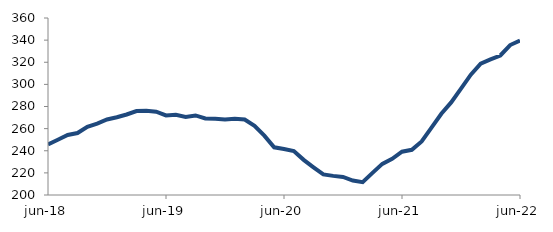
| Category | Series 0 |
|---|---|
| 2018-06-01 | 245.721 |
| 2018-07-01 | 249.922 |
| 2018-08-01 | 254.259 |
| 2018-09-01 | 256.028 |
| 2018-10-01 | 261.709 |
| 2018-11-01 | 264.559 |
| 2018-12-01 | 268.288 |
| 2019-01-01 | 270.264 |
| 2019-02-01 | 272.765 |
| 2019-03-01 | 275.922 |
| 2019-04-01 | 276.17 |
| 2019-05-01 | 275.323 |
| 2019-06-01 | 271.933 |
| 2019-07-01 | 272.528 |
| 2019-08-01 | 270.617 |
| 2019-09-01 | 271.909 |
| 2019-10-01 | 269.246 |
| 2019-11-01 | 268.873 |
| 2019-12-01 | 268.319 |
| 2020-01-01 | 268.914 |
| 2020-02-01 | 268.233 |
| 2020-03-01 | 262.58 |
| 2020-04-01 | 253.663 |
| 2020-05-01 | 243.088 |
| 2020-06-01 | 241.541 |
| 2020-07-01 | 239.786 |
| 2020-08-01 | 231.766 |
| 2020-09-01 | 225.047 |
| 2020-10-01 | 218.571 |
| 2020-11-01 | 217.286 |
| 2020-12-01 | 216.368 |
| 2021-01-01 | 213.087 |
| 2021-02-01 | 211.643 |
| 2021-03-01 | 220.04 |
| 2021-04-01 | 228.12 |
| 2021-05-01 | 232.717 |
| 2021-06-01 | 239.097 |
| 2021-07-01 | 240.846 |
| 2021-08-01 | 248.449 |
| 2021-09-01 | 260.934 |
| 2021-10-01 | 273.441 |
| 2021-11-01 | 283.683 |
| 2021-12-01 | 296.134 |
| 2022-01-01 | 308.804 |
| 2022-02-01 | 318.726 |
| 2022-03-01 | 322.592 |
| 2022-04-01 | 326.114 |
| 2022-05-01 | 335.557 |
| 2022-06-01 | 339.684 |